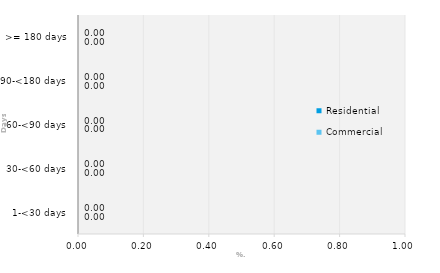
| Category | Commercial | Residential |
|---|---|---|
| 1-<30 days | 0 | 0 |
| 30-<60 days | 0 | 0 |
| 60-<90 days | 0 | 0 |
| 90-<180 days | 0 | 0 |
| >= 180 days | 0 | 0 |